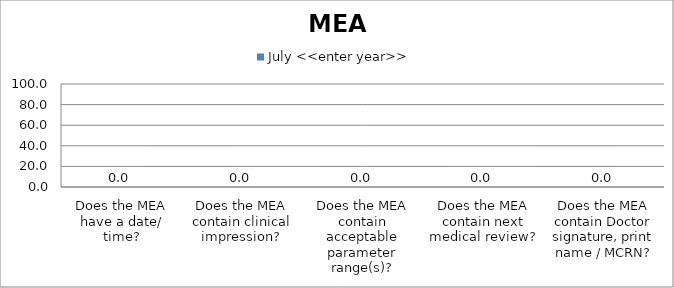
| Category | July <<enter year>> |
|---|---|
| Does the MEA have a date/ time? | 0 |
| Does the MEA contain clinical impression? | 0 |
| Does the MEA contain acceptable parameter range(s)? | 0 |
| Does the MEA contain next medical review? | 0 |
| Does the MEA contain Doctor signature, print name / MCRN? | 0 |